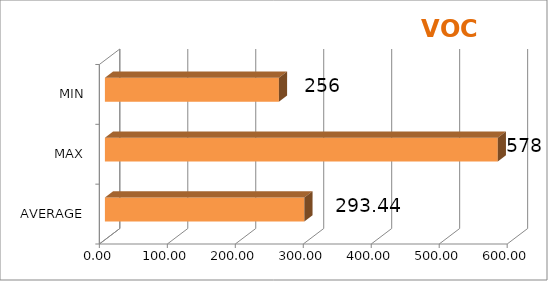
| Category | Series 0 |
|---|---|
| AVERAGE | 293.437 |
| MAX | 578 |
| MIN | 256 |